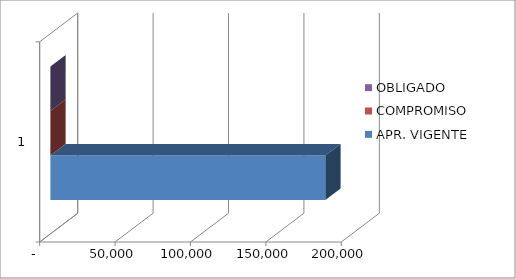
| Category | APR. VIGENTE | COMPROMISO | % EJECUTADO | OBLIGADO |
|---|---|---|---|---|
| 0 | 182341.791 | 0 |  | 0 |